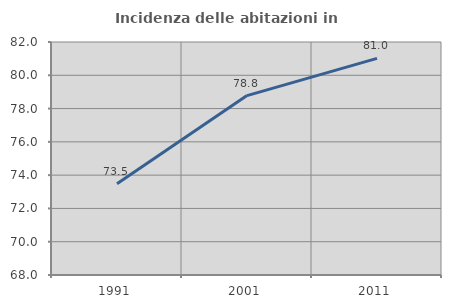
| Category | Incidenza delle abitazioni in proprietà  |
|---|---|
| 1991.0 | 73.487 |
| 2001.0 | 78.781 |
| 2011.0 | 81.013 |